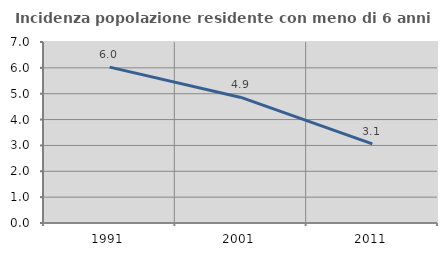
| Category | Incidenza popolazione residente con meno di 6 anni |
|---|---|
| 1991.0 | 6.029 |
| 2001.0 | 4.855 |
| 2011.0 | 3.059 |